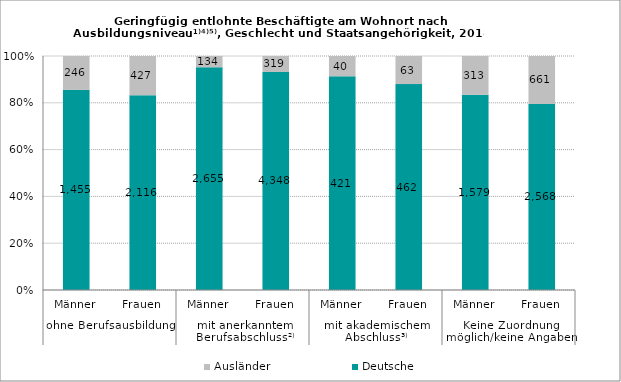
| Category | Deutsche | Ausländer |
|---|---|---|
| 0 | 1455 | 246 |
| 1 | 2116 | 427 |
| 2 | 2655 | 134 |
| 3 | 4348 | 319 |
| 4 | 421 | 40 |
| 5 | 462 | 63 |
| 6 | 1579 | 313 |
| 7 | 2568 | 661 |